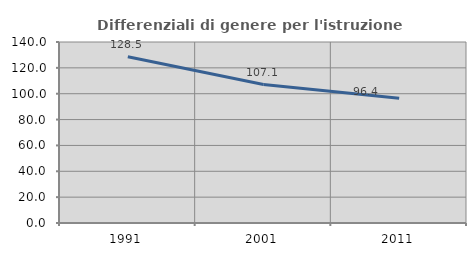
| Category | Differenziali di genere per l'istruzione superiore |
|---|---|
| 1991.0 | 128.53 |
| 2001.0 | 107.122 |
| 2011.0 | 96.415 |